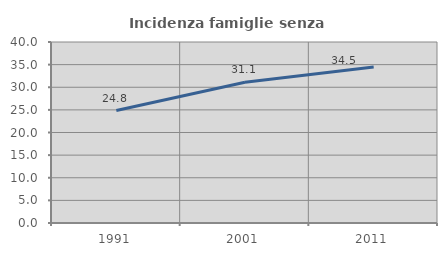
| Category | Incidenza famiglie senza nuclei |
|---|---|
| 1991.0 | 24.844 |
| 2001.0 | 31.104 |
| 2011.0 | 34.469 |